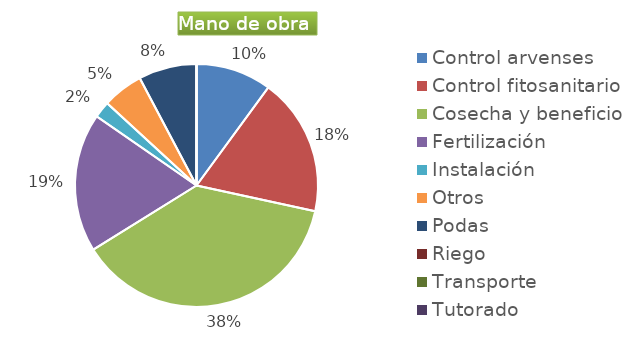
| Category | Series 0 |
|---|---|
| Control arvenses | 6806410 |
| Control fitosanitario | 12408609 |
| Cosecha y beneficio | 25531892 |
| Fertilización | 12513323 |
| Instalación | 1488433 |
| Otros | 3664990 |
| Podas | 5235700 |
| Riego | 0 |
| Transporte | 0 |
| Tutorado | 0 |